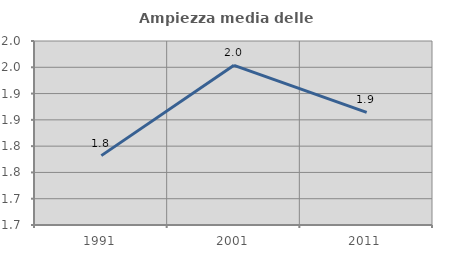
| Category | Ampiezza media delle famiglie |
|---|---|
| 1991.0 | 1.782 |
| 2001.0 | 1.954 |
| 2011.0 | 1.864 |